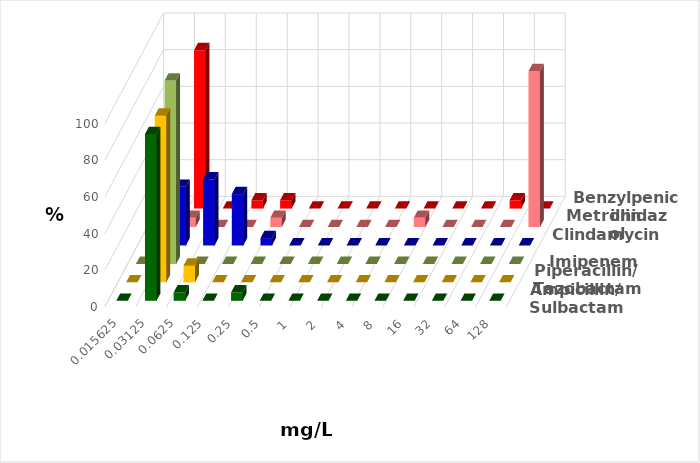
| Category | Ampicillin/ Sulbactam | Piperacillin/ Tazobactam | Imipenem | Clindamycin | Metronidazol | Benzylpenicillin |
|---|---|---|---|---|---|---|
| 0.015625 | 0 | 0 | 0 | 0 | 0 | 0 |
| 0.03125 | 90.909 | 90.909 | 100 | 32 | 5 | 86.364 |
| 0.0625 | 4.545 | 9.091 | 0 | 36 | 0 | 0 |
| 0.125 | 0 | 0 | 0 | 28 | 0 | 4.545 |
| 0.25 | 4.545 | 0 | 0 | 4 | 5 | 4.545 |
| 0.5 | 0 | 0 | 0 | 0 | 0 | 0 |
| 1.0 | 0 | 0 | 0 | 0 | 0 | 0 |
| 2.0 | 0 | 0 | 0 | 0 | 0 | 0 |
| 4.0 | 0 | 0 | 0 | 0 | 0 | 0 |
| 8.0 | 0 | 0 | 0 | 0 | 5 | 0 |
| 16.0 | 0 | 0 | 0 | 0 | 0 | 0 |
| 32.0 | 0 | 0 | 0 | 0 | 0 | 0 |
| 64.0 | 0 | 0 | 0 | 0 | 0 | 4.545 |
| 128.0 | 0 | 0 | 0 | 0 | 85 | 0 |